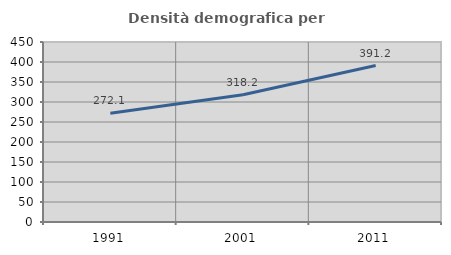
| Category | Densità demografica |
|---|---|
| 1991.0 | 272.091 |
| 2001.0 | 318.162 |
| 2011.0 | 391.179 |